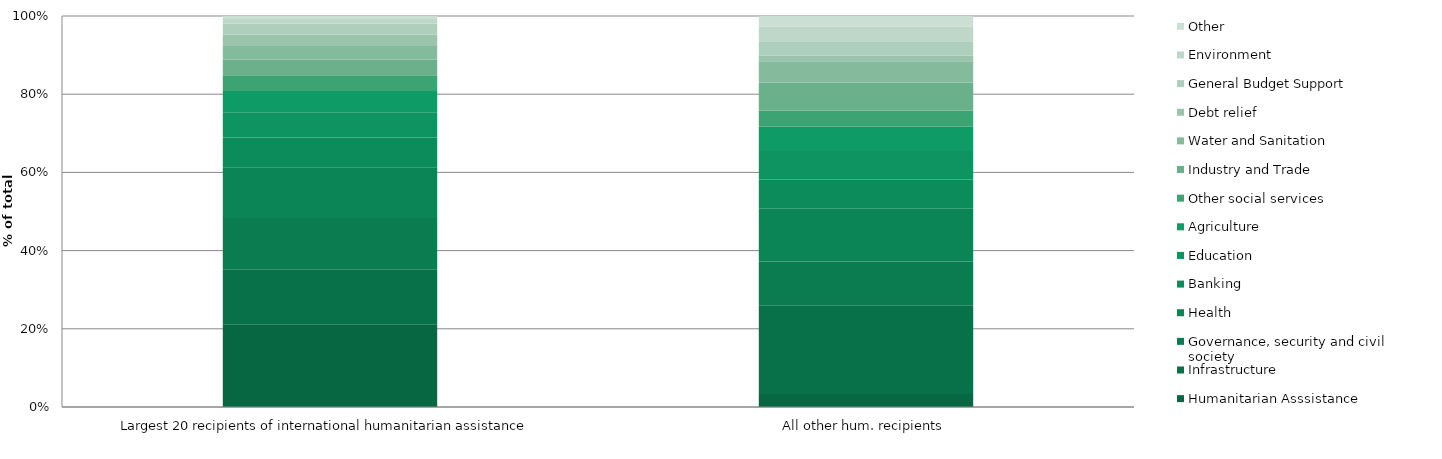
| Category | Humanitarian Asssistance | Infrastructure  | Governance, security and civil society | Health | Banking | Education | Agriculture | Other social services | Industry and Trade | Water and Sanitation | Debt relief | General Budget Support | Environment | Other |
|---|---|---|---|---|---|---|---|---|---|---|---|---|---|---|
| Largest 20 recipients of international humanitarian assistance | 46.98 | 31.08 | 29.104 | 28.822 | 16.808 | 14.356 | 12.037 | 8.959 | 8.755 | 7.919 | 6.405 | 6.23 | 2.626 | 1.683 |
| All other hum. recipients | 22.146 | 149.354 | 74.943 | 89.17 | 49.441 | 48.04 | 41.293 | 26.917 | 47.804 | 36.09 | 9.938 | 23.827 | 24.75 | 18.091 |